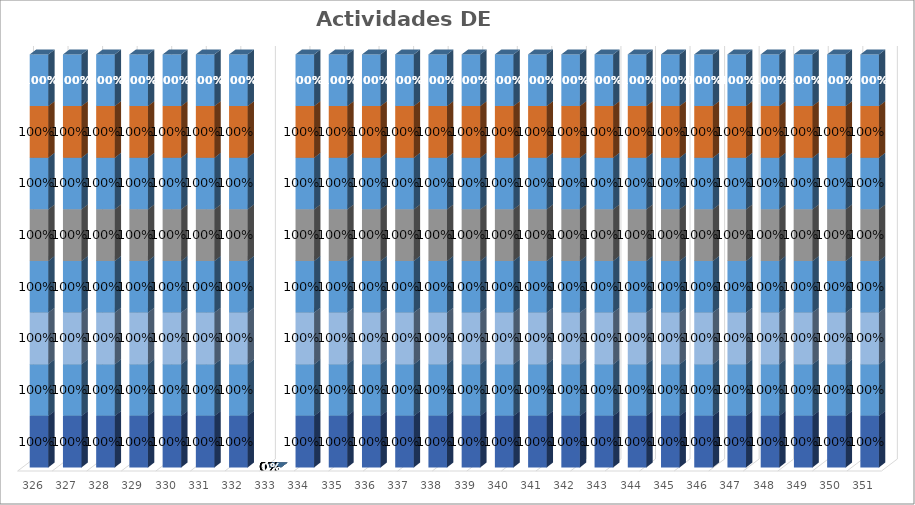
| Category | % Avance |
|---|---|
| 326.0 | 1 |
| 327.0 | 1 |
| 328.0 | 1 |
| 329.0 | 1 |
| 330.0 | 1 |
| 331.0 | 1 |
| 332.0 | 1 |
| 333.0 | 0 |
| 334.0 | 1 |
| 335.0 | 1 |
| 336.0 | 1 |
| 337.0 | 1 |
| 338.0 | 1 |
| 339.0 | 1 |
| 340.0 | 1 |
| 341.0 | 1 |
| 342.0 | 1 |
| 343.0 | 1 |
| 344.0 | 1 |
| 345.0 | 1 |
| 346.0 | 1 |
| 347.0 | 1 |
| 348.0 | 1 |
| 349.0 | 1 |
| 350.0 | 1 |
| 351.0 | 1 |